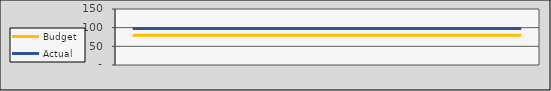
| Category | Budget | Actual |
|---|---|---|
| 2020-07-01 | 80 | 98 |
| 2020-08-01 | 80 | 98 |
| 2020-09-01 | 80 | 98 |
| 2020-10-02 | 80 | 98 |
| 2020-11-02 | 80 | 98 |
| 2020-12-03 | 80 | 98 |
| 2021-01-03 | 80 | 98 |
| 2021-02-03 | 80 | 98 |
| 2021-03-06 | 80 | 98 |
| 2021-04-06 | 80 | 98 |
| 2021-05-07 | 80 | 98 |
| 2021-06-07 | 80 | 98 |